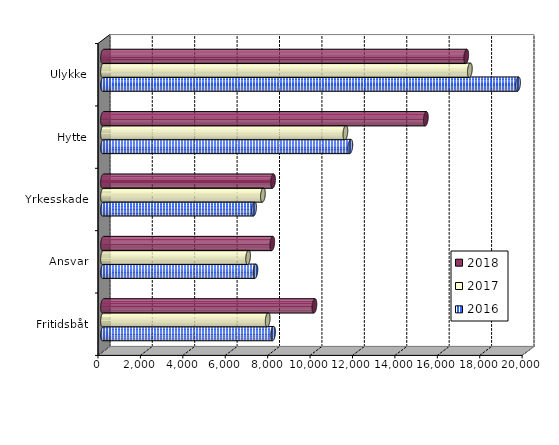
| Category | 2016 | 2017 | 2018 |
|---|---|---|---|
| Fritidsbåt | 8019.147 | 7767.226 | 9968.629 |
| Ansvar | 7187.708 | 6841.481 | 7980.507 |
| Yrkesskade | 7122 | 7540.139 | 8017.537 |
| Hytte | 11662.406 | 11429.68 | 15222.904 |
| Ulykke | 19570.411 | 17298.664 | 17128.16 |